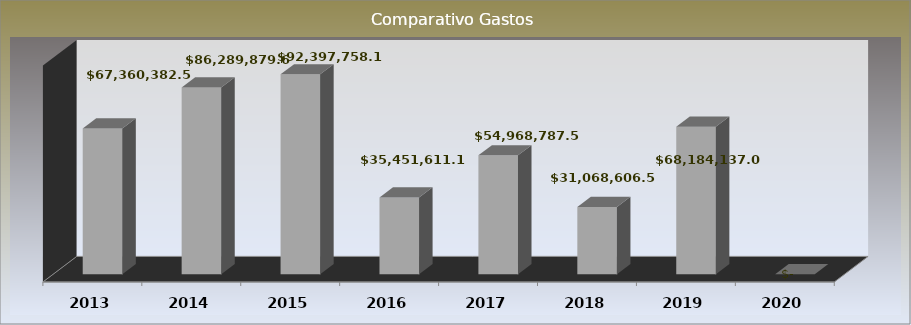
| Category | Series 0 |
|---|---|
| 2013.0 | 67360382.57 |
| 2014.0 | 86289879.62 |
| 2015.0 | 92397758.15 |
| 2016.0 | 35451611.18 |
| 2017.0 | 54968787.54 |
| 2018.0 | 31068606.51 |
| 2019.0 | 68184137.03 |
| 2020.0 | 0 |